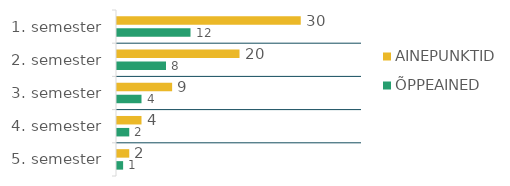
| Category | AINEPUNKTID | ÕPPEAINED |
|---|---|---|
| 1. semester | 30 | 12 |
| 2. semester | 20 | 8 |
| 3. semester | 9 | 4 |
| 4. semester | 4 | 2 |
| 5. semester | 2 | 1 |